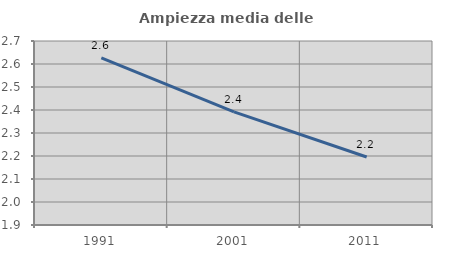
| Category | Ampiezza media delle famiglie |
|---|---|
| 1991.0 | 2.626 |
| 2001.0 | 2.392 |
| 2011.0 | 2.196 |